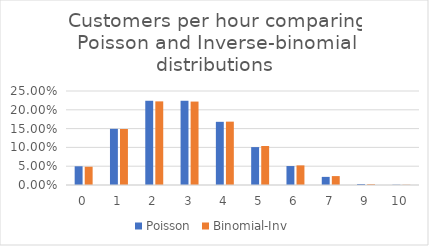
| Category | Poisson | Binomial-Inv |
|---|---|---|
| 0.0 | 0.05 | 0.049 |
| 1.0 | 0.149 | 0.149 |
| 2.0 | 0.224 | 0.222 |
| 3.0 | 0.224 | 0.222 |
| 4.0 | 0.168 | 0.168 |
| 5.0 | 0.101 | 0.104 |
| 6.0 | 0.05 | 0.052 |
| 7.0 | 0.022 | 0.024 |
| 9.0 | 0.003 | 0.002 |
| 10.0 | 0.001 | 0.001 |